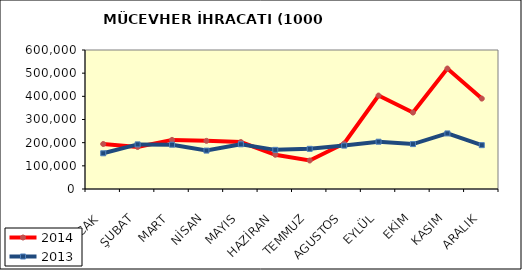
| Category | 2014 | 2013 |
|---|---|---|
| OCAK | 194226.767 | 154170.085 |
| ŞUBAT | 181236.588 | 192587.215 |
| MART | 212006.269 | 191244.978 |
| NİSAN | 207857.659 | 165840.556 |
| MAYIS | 202849.558 | 192942.121 |
| HAZİRAN | 147772.867 | 168991.027 |
| TEMMUZ | 122982.594 | 173444.18 |
| AGUSTOS | 196394.134 | 187327.406 |
| EYLÜL | 403330.068 | 204095.255 |
| EKİM | 329975.798 | 193811.104 |
| KASIM | 519884.092 | 239853.076 |
| ARALIK | 390233.785 | 189189.448 |